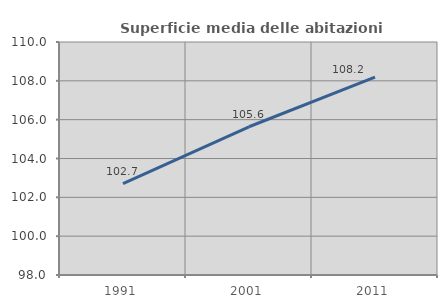
| Category | Superficie media delle abitazioni occupate |
|---|---|
| 1991.0 | 102.711 |
| 2001.0 | 105.634 |
| 2011.0 | 108.19 |